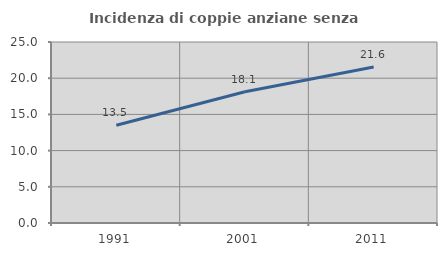
| Category | Incidenza di coppie anziane senza figli  |
|---|---|
| 1991.0 | 13.511 |
| 2001.0 | 18.128 |
| 2011.0 | 21.557 |